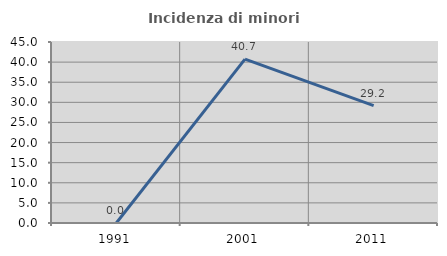
| Category | Incidenza di minori stranieri |
|---|---|
| 1991.0 | 0 |
| 2001.0 | 40.741 |
| 2011.0 | 29.167 |